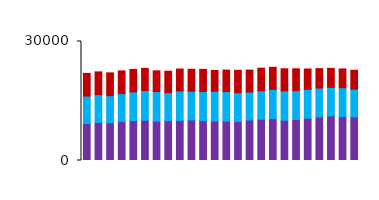
| Category | Item2 |
|---|---|
| 0 | 5711 |
| 1 | 5748 |
| 2 | 5757 |
| 3 | 5715 |
| 4 | 5678 |
| 5 | 5549 |
| 6 | 5232 |
| 7 | 5410 |
| 8 | 5506 |
| 9 | 5526 |
| 10 | 5596 |
| 11 | 5237 |
| 12 | 5411 |
| 13 | 5645 |
| 14 | 5529 |
| 15 | 5695 |
| 16 | 5574 |
| 17 | 5571 |
| 18 | 5503 |
| 19 | 5105 |
| 20 | 4885 |
| 21 | 4784 |
| 22 | 4727 |
| 23 | 4739 |